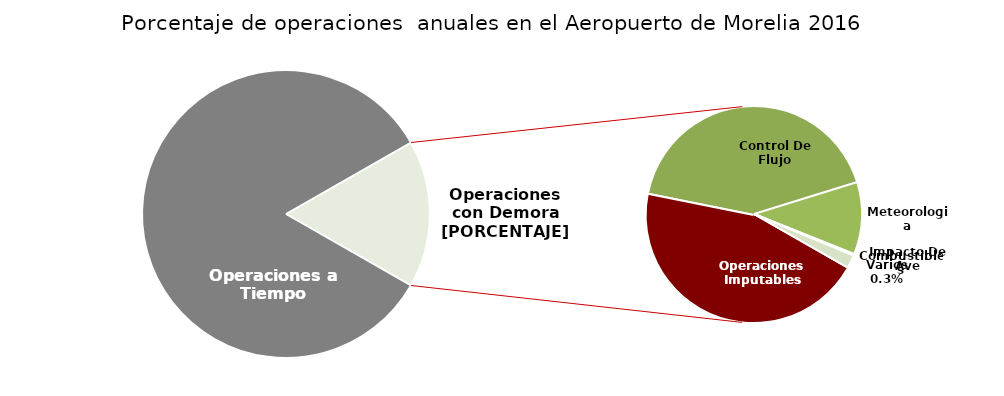
| Category | Series 0 |
|---|---|
| Operaciones a Tiempo | 3599 |
| Operaciones Imputables | 320 |
| Control De Flujo | 300 |
| Meteorologia | 77 |
| Combustibles | 1 |
| Impacto De Ave | 1 |
| Varios | 14 |